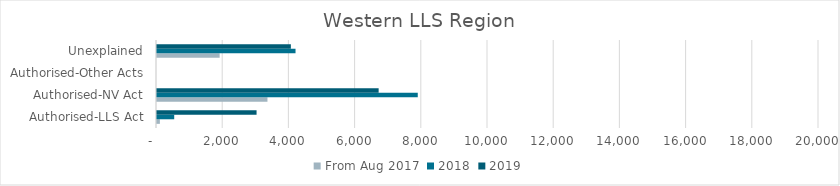
| Category | From Aug 2017 | 2018 | 2019 |
|---|---|---|---|
| Authorised-LLS Act | 87 | 520 | 3008 |
| Authorised-NV Act | 3337 | 7878 | 6696 |
| Authorised-Other Acts | 0 | 0 | 0 |
| Unexplained | 1893 | 4185 | 4044 |